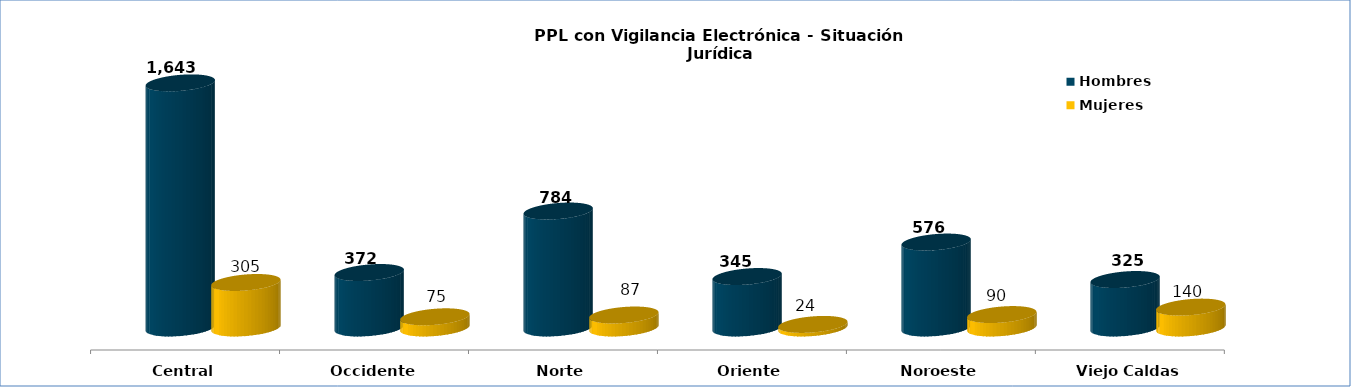
| Category | Hombres | Mujeres |
|---|---|---|
| Central | 1643 | 305 |
| Occidente | 372 | 75 |
| Norte | 784 | 87 |
| Oriente | 345 | 24 |
| Noroeste | 576 | 90 |
| Viejo Caldas | 325 | 140 |